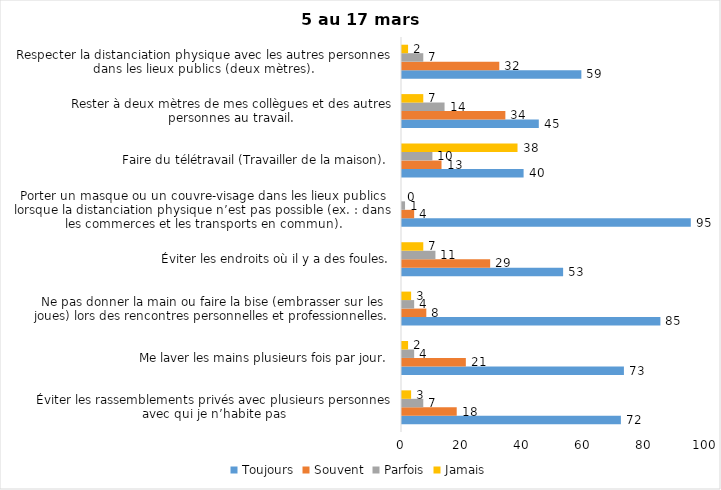
| Category | Toujours | Souvent | Parfois | Jamais |
|---|---|---|---|---|
| Éviter les rassemblements privés avec plusieurs personnes avec qui je n’habite pas | 72 | 18 | 7 | 3 |
| Me laver les mains plusieurs fois par jour. | 73 | 21 | 4 | 2 |
| Ne pas donner la main ou faire la bise (embrasser sur les joues) lors des rencontres personnelles et professionnelles. | 85 | 8 | 4 | 3 |
| Éviter les endroits où il y a des foules. | 53 | 29 | 11 | 7 |
| Porter un masque ou un couvre-visage dans les lieux publics lorsque la distanciation physique n’est pas possible (ex. : dans les commerces et les transports en commun). | 95 | 4 | 1 | 0 |
| Faire du télétravail (Travailler de la maison). | 40 | 13 | 10 | 38 |
| Rester à deux mètres de mes collègues et des autres personnes au travail. | 45 | 34 | 14 | 7 |
| Respecter la distanciation physique avec les autres personnes dans les lieux publics (deux mètres). | 59 | 32 | 7 | 2 |